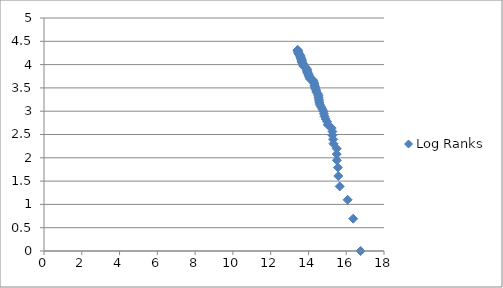
| Category | Log Ranks |
|---|---|
| 16.760307262613008 | 0 |
| 16.3706277375923 | 0.693 |
| 16.0741044732111 | 1.099 |
| 15.65606114374226 | 1.386 |
| 15.579979505456368 | 1.609 |
| 15.560901952394795 | 1.792 |
| 15.504641332267619 | 1.946 |
| 15.49750817317282 | 2.079 |
| 15.494125591576976 | 2.197 |
| 15.32465465287539 | 2.303 |
| 15.302805694872255 | 2.398 |
| 15.269907160744758 | 2.485 |
| 15.268184946732339 | 2.565 |
| 15.230361034337063 | 2.639 |
| 15.022921345646932 | 2.708 |
| 14.987954923587669 | 2.773 |
| 14.914480116137366 | 2.833 |
| 14.85108009516229 | 2.89 |
| 14.821188874741882 | 2.944 |
| 14.796508671718223 | 2.996 |
| 14.734448183722057 | 3.045 |
| 14.670432991563192 | 3.091 |
| 14.607353997269053 | 3.135 |
| 14.583364852585149 | 3.178 |
| 14.56211888142926 | 3.219 |
| 14.551856586089967 | 3.258 |
| 14.535579085152936 | 3.296 |
| 14.524257920452479 | 3.332 |
| 14.50968071510521 | 3.367 |
| 14.43917153108138 | 3.401 |
| 14.41390630259346 | 3.434 |
| 14.388251264661122 | 3.466 |
| 14.355191241257353 | 3.497 |
| 14.347196484784305 | 3.526 |
| 14.321298714972981 | 3.555 |
| 14.317861573462697 | 3.584 |
| 14.285895989314309 | 3.611 |
| 14.254238280337745 | 3.638 |
| 14.253318937593333 | 3.664 |
| 14.087998786343885 | 3.689 |
| 14.066838763928045 | 3.714 |
| 14.034401881358132 | 3.738 |
| 14.018962291842664 | 3.761 |
| 14.002937393948198 | 3.784 |
| 13.989894024656659 | 3.807 |
| 13.941287336135085 | 3.829 |
| 13.93267918268669 | 3.85 |
| 13.926701245095403 | 3.871 |
| 13.924985398169259 | 3.892 |
| 13.900554584321453 | 3.912 |
| 13.849032370881652 | 3.932 |
| 13.827456915232634 | 3.951 |
| 13.727857884478905 | 3.97 |
| 13.72026867582761 | 3.989 |
| 13.715727791037137 | 4.007 |
| 13.704612516248297 | 4.025 |
| 13.657591620497197 | 4.043 |
| 13.648394016805288 | 4.06 |
| 13.648171796420852 | 4.078 |
| 13.63868387665228 | 4.094 |
| 13.637034398145223 | 4.111 |
| 13.60257720472492 | 4.127 |
| 13.592939342834459 | 4.143 |
| 13.589538008806517 | 4.159 |
| 13.568781031510532 | 4.174 |
| 13.562863527878148 | 4.19 |
| 13.55419384462346 | 4.205 |
| 13.507175336625346 | 4.22 |
| 13.481477344506366 | 4.234 |
| 13.47374393075866 | 4.248 |
| 13.4579151905658 | 4.263 |
| 13.45668616275225 | 4.277 |
| 13.440353000841553 | 4.29 |
| 13.43374781621692 | 4.304 |
| 13.432088213231657 | 4.317 |